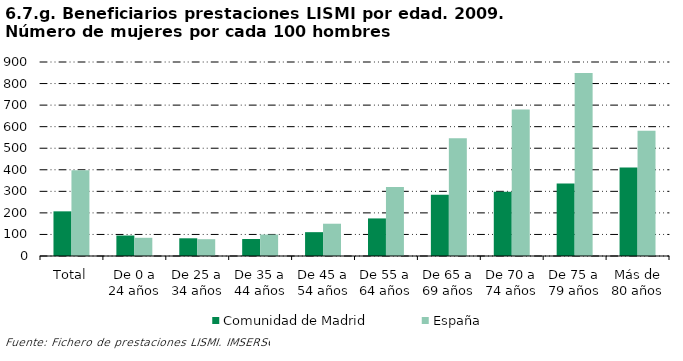
| Category | Comunidad de Madrid | España |
|---|---|---|
| Total | 207.164 | 397.406 |
| De 0 a 24 años | 95 | 84.463 |
| De 25 a 34 años | 82.143 | 77.976 |
| De 35 a 44 años | 78.75 | 99.489 |
| De 45 a 54 años | 110.553 | 149.791 |
| De 55 a 64 años | 174.302 | 320.412 |
| De 65 a 69 años | 284.615 | 546.563 |
| De 70 a 74 años | 297.701 | 679.342 |
| De 75 a 79 años | 336.792 | 848.769 |
| Más de 80 años | 410.448 | 581.284 |